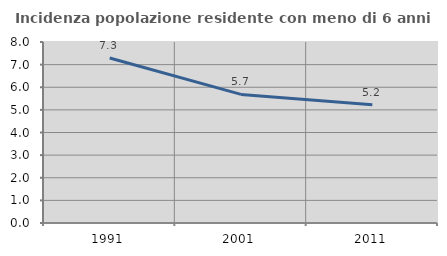
| Category | Incidenza popolazione residente con meno di 6 anni |
|---|---|
| 1991.0 | 7.293 |
| 2001.0 | 5.684 |
| 2011.0 | 5.225 |